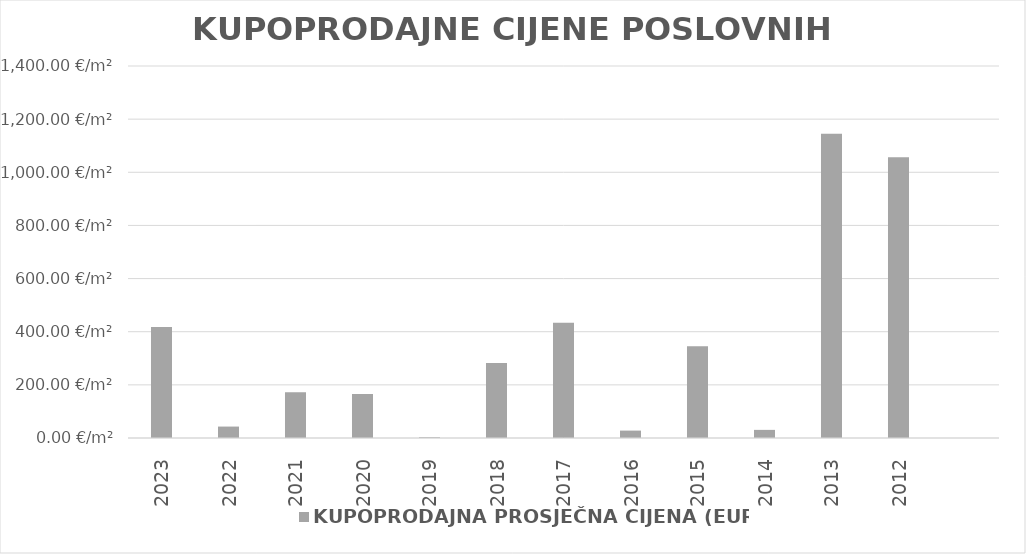
| Category | KUPOPRODAJNA PROSJEČNA CIJENA (EUR/m²) |
|---|---|
| 2023 | 1901-02-20 08:25:29 |
| 2022 | 1900-02-12 00:32:19 |
| 2021 | 1900-06-20 05:37:30 |
| 2020 | 1900-06-14 01:05:28 |
| 2019 | 1900-01-02 22:47:26 |
| 2018 | 1900-10-08 13:07:44 |
| 2017 | 1901-03-08 09:26:09 |
| 2016 | 1900-01-27 19:57:27 |
| 2015 | 1900-12-10 10:04:02 |
| 2014 | 1900-01-30 13:54:32 |
| 2013 | 1903-02-17 21:00:31 |
| 2012 | 1902-11-21 06:36:23 |